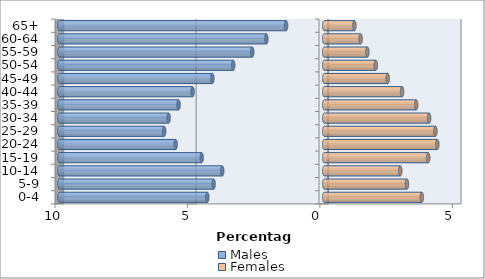
| Category | Males | Females |
|---|---|---|
| 0-4 | -4.415 | 3.685 |
| 5-9 | -4.176 | 3.124 |
| 10-14 | -3.851 | 2.871 |
| 15-19 | -4.627 | 3.928 |
| 20-24 | -5.608 | 4.27 |
| 25-29 | -6.043 | 4.199 |
| 30-34 | -5.873 | 3.96 |
| 35-39 | -5.5 | 3.473 |
| 40-44 | -4.97 | 2.941 |
| 45-49 | -4.222 | 2.398 |
| 50-54 | -3.436 | 1.948 |
| 55-59 | -2.718 | 1.629 |
| 60-64 | -2.184 | 1.374 |
| 65+ | -1.44 | 1.139 |